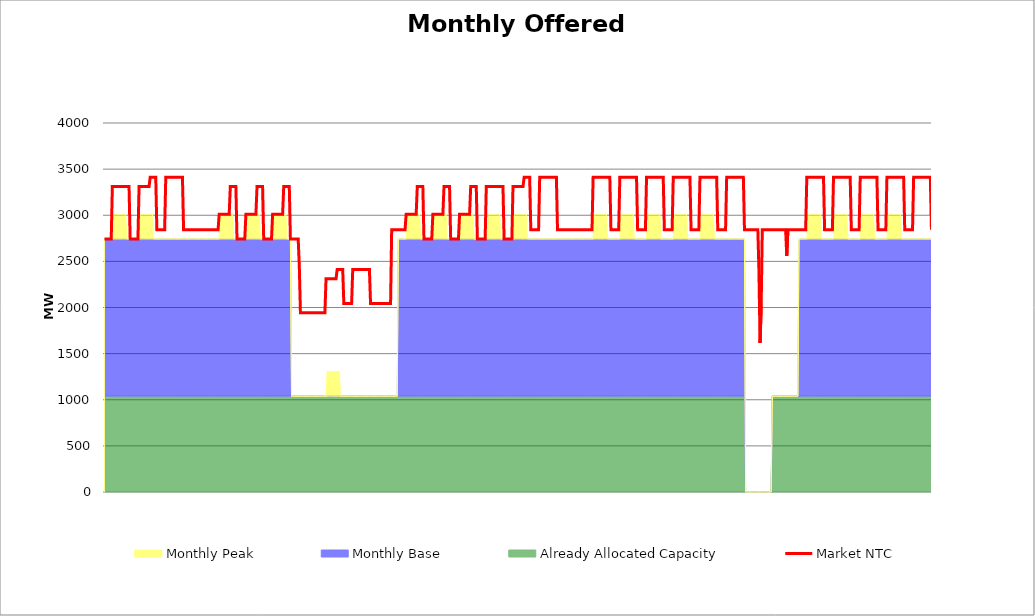
| Category | Market NTC |
|---|---|
| 0 | 2743 |
| 1 | 2743 |
| 2 | 2743 |
| 3 | 2743 |
| 4 | 2743 |
| 5 | 2743 |
| 6 | 2743 |
| 7 | 3311 |
| 8 | 3311 |
| 9 | 3311 |
| 10 | 3311 |
| 11 | 3311 |
| 12 | 3311 |
| 13 | 3311 |
| 14 | 3311 |
| 15 | 3311 |
| 16 | 3311 |
| 17 | 3311 |
| 18 | 3311 |
| 19 | 3311 |
| 20 | 3311 |
| 21 | 3311 |
| 22 | 3311 |
| 23 | 2743 |
| 24 | 2743 |
| 25 | 2743 |
| 26 | 2743 |
| 27 | 2743 |
| 28 | 2743 |
| 29 | 2743 |
| 30 | 2743 |
| 31 | 3311 |
| 32 | 3311 |
| 33 | 3311 |
| 34 | 3311 |
| 35 | 3311 |
| 36 | 3311 |
| 37 | 3311 |
| 38 | 3311 |
| 39 | 3311 |
| 40 | 3311 |
| 41 | 3411 |
| 42 | 3411 |
| 43 | 3411 |
| 44 | 3411 |
| 45 | 3411 |
| 46 | 3411 |
| 47 | 2843 |
| 48 | 2843 |
| 49 | 2843 |
| 50 | 2843 |
| 51 | 2843 |
| 52 | 2843 |
| 53 | 2843 |
| 54 | 2843 |
| 55 | 3411 |
| 56 | 3411 |
| 57 | 3411 |
| 58 | 3411 |
| 59 | 3411 |
| 60 | 3411 |
| 61 | 3411 |
| 62 | 3411 |
| 63 | 3411 |
| 64 | 3411 |
| 65 | 3411 |
| 66 | 3411 |
| 67 | 3411 |
| 68 | 3411 |
| 69 | 3411 |
| 70 | 3411 |
| 71 | 2843 |
| 72 | 2843 |
| 73 | 2843 |
| 74 | 2843 |
| 75 | 2843 |
| 76 | 2843 |
| 77 | 2843 |
| 78 | 2843 |
| 79 | 2843 |
| 80 | 2843 |
| 81 | 2843 |
| 82 | 2843 |
| 83 | 2843 |
| 84 | 2843 |
| 85 | 2843 |
| 86 | 2843 |
| 87 | 2843 |
| 88 | 2843 |
| 89 | 2843 |
| 90 | 2843 |
| 91 | 2843 |
| 92 | 2843 |
| 93 | 2843 |
| 94 | 2843 |
| 95 | 2843 |
| 96 | 2843 |
| 97 | 2843 |
| 98 | 2843 |
| 99 | 2843 |
| 100 | 2843 |
| 101 | 2843 |
| 102 | 2843 |
| 103 | 3011 |
| 104 | 3011 |
| 105 | 3011 |
| 106 | 3011 |
| 107 | 3011 |
| 108 | 3011 |
| 109 | 3011 |
| 110 | 3011 |
| 111 | 3011 |
| 112 | 3011 |
| 113 | 3311 |
| 114 | 3311 |
| 115 | 3311 |
| 116 | 3311 |
| 117 | 3311 |
| 118 | 3311 |
| 119 | 2743 |
| 120 | 2743 |
| 121 | 2743 |
| 122 | 2743 |
| 123 | 2743 |
| 124 | 2743 |
| 125 | 2743 |
| 126 | 2743 |
| 127 | 3011 |
| 128 | 3011 |
| 129 | 3011 |
| 130 | 3011 |
| 131 | 3011 |
| 132 | 3011 |
| 133 | 3011 |
| 134 | 3011 |
| 135 | 3011 |
| 136 | 3011 |
| 137 | 3311 |
| 138 | 3311 |
| 139 | 3311 |
| 140 | 3311 |
| 141 | 3311 |
| 142 | 3311 |
| 143 | 2743 |
| 144 | 2743 |
| 145 | 2743 |
| 146 | 2743 |
| 147 | 2743 |
| 148 | 2743 |
| 149 | 2743 |
| 150 | 2743 |
| 151 | 3011 |
| 152 | 3011 |
| 153 | 3011 |
| 154 | 3011 |
| 155 | 3011 |
| 156 | 3011 |
| 157 | 3011 |
| 158 | 3011 |
| 159 | 3011 |
| 160 | 3011 |
| 161 | 3311 |
| 162 | 3311 |
| 163 | 3311 |
| 164 | 3311 |
| 165 | 3311 |
| 166 | 3311 |
| 167 | 2743 |
| 168 | 2743 |
| 169 | 2743 |
| 170 | 2743 |
| 171 | 2743 |
| 172 | 2743 |
| 173 | 2743 |
| 174 | 2743 |
| 175 | 2443 |
| 176 | 1943 |
| 177 | 1943 |
| 178 | 1943 |
| 179 | 1943 |
| 180 | 1943 |
| 181 | 1943 |
| 182 | 1943 |
| 183 | 1943 |
| 184 | 1943 |
| 185 | 1943 |
| 186 | 1943 |
| 187 | 1943 |
| 188 | 1943 |
| 189 | 1943 |
| 190 | 1943 |
| 191 | 1943 |
| 192 | 1943 |
| 193 | 1943 |
| 194 | 1943 |
| 195 | 1943 |
| 196 | 1943 |
| 197 | 1943 |
| 198 | 1943 |
| 199 | 2311 |
| 200 | 2311 |
| 201 | 2311 |
| 202 | 2311 |
| 203 | 2311 |
| 204 | 2311 |
| 205 | 2311 |
| 206 | 2311 |
| 207 | 2311 |
| 208 | 2311 |
| 209 | 2411 |
| 210 | 2411 |
| 211 | 2411 |
| 212 | 2411 |
| 213 | 2411 |
| 214 | 2411 |
| 215 | 2043 |
| 216 | 2043 |
| 217 | 2043 |
| 218 | 2043 |
| 219 | 2043 |
| 220 | 2043 |
| 221 | 2043 |
| 222 | 2043 |
| 223 | 2411 |
| 224 | 2411 |
| 225 | 2411 |
| 226 | 2411 |
| 227 | 2411 |
| 228 | 2411 |
| 229 | 2411 |
| 230 | 2411 |
| 231 | 2411 |
| 232 | 2411 |
| 233 | 2411 |
| 234 | 2411 |
| 235 | 2411 |
| 236 | 2411 |
| 237 | 2411 |
| 238 | 2411 |
| 239 | 2043 |
| 240 | 2043 |
| 241 | 2043 |
| 242 | 2043 |
| 243 | 2043 |
| 244 | 2043 |
| 245 | 2043 |
| 246 | 2043 |
| 247 | 2043 |
| 248 | 2043 |
| 249 | 2043 |
| 250 | 2043 |
| 251 | 2043 |
| 252 | 2043 |
| 253 | 2043 |
| 254 | 2043 |
| 255 | 2043 |
| 256 | 2043 |
| 257 | 2043 |
| 258 | 2843 |
| 259 | 2843 |
| 260 | 2843 |
| 261 | 2843 |
| 262 | 2843 |
| 263 | 2843 |
| 264 | 2843 |
| 265 | 2843 |
| 266 | 2843 |
| 267 | 2843 |
| 268 | 2843 |
| 269 | 2843 |
| 270 | 2843 |
| 271 | 3011 |
| 272 | 3011 |
| 273 | 3011 |
| 274 | 3011 |
| 275 | 3011 |
| 276 | 3011 |
| 277 | 3011 |
| 278 | 3011 |
| 279 | 3011 |
| 280 | 3011 |
| 281 | 3311 |
| 282 | 3311 |
| 283 | 3311 |
| 284 | 3311 |
| 285 | 3311 |
| 286 | 3311 |
| 287 | 2743 |
| 288 | 2743 |
| 289 | 2743 |
| 290 | 2743 |
| 291 | 2743 |
| 292 | 2743 |
| 293 | 2743 |
| 294 | 2743 |
| 295 | 3011 |
| 296 | 3011 |
| 297 | 3011 |
| 298 | 3011 |
| 299 | 3011 |
| 300 | 3011 |
| 301 | 3011 |
| 302 | 3011 |
| 303 | 3011 |
| 304 | 3011 |
| 305 | 3311 |
| 306 | 3311 |
| 307 | 3311 |
| 308 | 3311 |
| 309 | 3311 |
| 310 | 3311 |
| 311 | 2743 |
| 312 | 2743 |
| 313 | 2743 |
| 314 | 2743 |
| 315 | 2743 |
| 316 | 2743 |
| 317 | 2743 |
| 318 | 2743 |
| 319 | 3011 |
| 320 | 3011 |
| 321 | 3011 |
| 322 | 3011 |
| 323 | 3011 |
| 324 | 3011 |
| 325 | 3011 |
| 326 | 3011 |
| 327 | 3011 |
| 328 | 3011 |
| 329 | 3311 |
| 330 | 3311 |
| 331 | 3311 |
| 332 | 3311 |
| 333 | 3311 |
| 334 | 3311 |
| 335 | 2743 |
| 336 | 2743 |
| 337 | 2743 |
| 338 | 2743 |
| 339 | 2743 |
| 340 | 2743 |
| 341 | 2743 |
| 342 | 2743 |
| 343 | 3311 |
| 344 | 3311 |
| 345 | 3311 |
| 346 | 3311 |
| 347 | 3311 |
| 348 | 3311 |
| 349 | 3311 |
| 350 | 3311 |
| 351 | 3311 |
| 352 | 3311 |
| 353 | 3311 |
| 354 | 3311 |
| 355 | 3311 |
| 356 | 3311 |
| 357 | 3311 |
| 358 | 3311 |
| 359 | 2743 |
| 360 | 2743 |
| 361 | 2743 |
| 362 | 2743 |
| 363 | 2743 |
| 364 | 2743 |
| 365 | 2743 |
| 366 | 2743 |
| 367 | 3311 |
| 368 | 3311 |
| 369 | 3311 |
| 370 | 3311 |
| 371 | 3311 |
| 372 | 3311 |
| 373 | 3311 |
| 374 | 3311 |
| 375 | 3311 |
| 376 | 3311 |
| 377 | 3411 |
| 378 | 3411 |
| 379 | 3411 |
| 380 | 3411 |
| 381 | 3411 |
| 382 | 3411 |
| 383 | 2843 |
| 384 | 2843 |
| 385 | 2843 |
| 386 | 2843 |
| 387 | 2843 |
| 388 | 2843 |
| 389 | 2843 |
| 390 | 2843 |
| 391 | 3411 |
| 392 | 3411 |
| 393 | 3411 |
| 394 | 3411 |
| 395 | 3411 |
| 396 | 3411 |
| 397 | 3411 |
| 398 | 3411 |
| 399 | 3411 |
| 400 | 3411 |
| 401 | 3411 |
| 402 | 3411 |
| 403 | 3411 |
| 404 | 3411 |
| 405 | 3411 |
| 406 | 3411 |
| 407 | 2843 |
| 408 | 2843 |
| 409 | 2843 |
| 410 | 2843 |
| 411 | 2843 |
| 412 | 2843 |
| 413 | 2843 |
| 414 | 2843 |
| 415 | 2843 |
| 416 | 2843 |
| 417 | 2843 |
| 418 | 2843 |
| 419 | 2843 |
| 420 | 2843 |
| 421 | 2843 |
| 422 | 2843 |
| 423 | 2843 |
| 424 | 2843 |
| 425 | 2843 |
| 426 | 2843 |
| 427 | 2843 |
| 428 | 2843 |
| 429 | 2843 |
| 430 | 2843 |
| 431 | 2843 |
| 432 | 2843 |
| 433 | 2843 |
| 434 | 2843 |
| 435 | 2843 |
| 436 | 2843 |
| 437 | 2843 |
| 438 | 2843 |
| 439 | 3411 |
| 440 | 3411 |
| 441 | 3411 |
| 442 | 3411 |
| 443 | 3411 |
| 444 | 3411 |
| 445 | 3411 |
| 446 | 3411 |
| 447 | 3411 |
| 448 | 3411 |
| 449 | 3411 |
| 450 | 3411 |
| 451 | 3411 |
| 452 | 3411 |
| 453 | 3411 |
| 454 | 3411 |
| 455 | 2843 |
| 456 | 2843 |
| 457 | 2843 |
| 458 | 2843 |
| 459 | 2843 |
| 460 | 2843 |
| 461 | 2843 |
| 462 | 2843 |
| 463 | 3411 |
| 464 | 3411 |
| 465 | 3411 |
| 466 | 3411 |
| 467 | 3411 |
| 468 | 3411 |
| 469 | 3411 |
| 470 | 3411 |
| 471 | 3411 |
| 472 | 3411 |
| 473 | 3411 |
| 474 | 3411 |
| 475 | 3411 |
| 476 | 3411 |
| 477 | 3411 |
| 478 | 3411 |
| 479 | 2843 |
| 480 | 2843 |
| 481 | 2843 |
| 482 | 2843 |
| 483 | 2843 |
| 484 | 2843 |
| 485 | 2843 |
| 486 | 2843 |
| 487 | 3411 |
| 488 | 3411 |
| 489 | 3411 |
| 490 | 3411 |
| 491 | 3411 |
| 492 | 3411 |
| 493 | 3411 |
| 494 | 3411 |
| 495 | 3411 |
| 496 | 3411 |
| 497 | 3411 |
| 498 | 3411 |
| 499 | 3411 |
| 500 | 3411 |
| 501 | 3411 |
| 502 | 3411 |
| 503 | 2843 |
| 504 | 2843 |
| 505 | 2843 |
| 506 | 2843 |
| 507 | 2843 |
| 508 | 2843 |
| 509 | 2843 |
| 510 | 2843 |
| 511 | 3411 |
| 512 | 3411 |
| 513 | 3411 |
| 514 | 3411 |
| 515 | 3411 |
| 516 | 3411 |
| 517 | 3411 |
| 518 | 3411 |
| 519 | 3411 |
| 520 | 3411 |
| 521 | 3411 |
| 522 | 3411 |
| 523 | 3411 |
| 524 | 3411 |
| 525 | 3411 |
| 526 | 3411 |
| 527 | 2843 |
| 528 | 2843 |
| 529 | 2843 |
| 530 | 2843 |
| 531 | 2843 |
| 532 | 2843 |
| 533 | 2843 |
| 534 | 2843 |
| 535 | 3411 |
| 536 | 3411 |
| 537 | 3411 |
| 538 | 3411 |
| 539 | 3411 |
| 540 | 3411 |
| 541 | 3411 |
| 542 | 3411 |
| 543 | 3411 |
| 544 | 3411 |
| 545 | 3411 |
| 546 | 3411 |
| 547 | 3411 |
| 548 | 3411 |
| 549 | 3411 |
| 550 | 3411 |
| 551 | 2843 |
| 552 | 2843 |
| 553 | 2843 |
| 554 | 2843 |
| 555 | 2843 |
| 556 | 2843 |
| 557 | 2843 |
| 558 | 2843 |
| 559 | 3411 |
| 560 | 3411 |
| 561 | 3411 |
| 562 | 3411 |
| 563 | 3411 |
| 564 | 3411 |
| 565 | 3411 |
| 566 | 3411 |
| 567 | 3411 |
| 568 | 3411 |
| 569 | 3411 |
| 570 | 3411 |
| 571 | 3411 |
| 572 | 3411 |
| 573 | 3411 |
| 574 | 3411 |
| 575 | 2843 |
| 576 | 2843 |
| 577 | 2843 |
| 578 | 2843 |
| 579 | 2843 |
| 580 | 2843 |
| 581 | 2843 |
| 582 | 2843 |
| 583 | 2843 |
| 584 | 2843 |
| 585 | 2843 |
| 586 | 2843 |
| 587 | 2843 |
| 588 | 2401 |
| 589 | 1615 |
| 590 | 2012 |
| 591 | 2843 |
| 592 | 2843 |
| 593 | 2843 |
| 594 | 2843 |
| 595 | 2843 |
| 596 | 2843 |
| 597 | 2843 |
| 598 | 2843 |
| 599 | 2843 |
| 600 | 2843 |
| 601 | 2843 |
| 602 | 2843 |
| 603 | 2843 |
| 604 | 2843 |
| 605 | 2843 |
| 606 | 2843 |
| 607 | 2843 |
| 608 | 2843 |
| 609 | 2843 |
| 610 | 2843 |
| 611 | 2843 |
| 612 | 2843 |
| 613 | 2559 |
| 614 | 2843 |
| 615 | 2843 |
| 616 | 2843 |
| 617 | 2843 |
| 618 | 2843 |
| 619 | 2843 |
| 620 | 2843 |
| 621 | 2843 |
| 622 | 2843 |
| 623 | 2843 |
| 624 | 2843 |
| 625 | 2843 |
| 626 | 2843 |
| 627 | 2843 |
| 628 | 2843 |
| 629 | 2843 |
| 630 | 2843 |
| 631 | 3411 |
| 632 | 3411 |
| 633 | 3411 |
| 634 | 3411 |
| 635 | 3411 |
| 636 | 3411 |
| 637 | 3411 |
| 638 | 3411 |
| 639 | 3411 |
| 640 | 3411 |
| 641 | 3411 |
| 642 | 3411 |
| 643 | 3411 |
| 644 | 3411 |
| 645 | 3411 |
| 646 | 3411 |
| 647 | 2843 |
| 648 | 2843 |
| 649 | 2843 |
| 650 | 2843 |
| 651 | 2843 |
| 652 | 2843 |
| 653 | 2843 |
| 654 | 2843 |
| 655 | 3411 |
| 656 | 3411 |
| 657 | 3411 |
| 658 | 3411 |
| 659 | 3411 |
| 660 | 3411 |
| 661 | 3411 |
| 662 | 3411 |
| 663 | 3411 |
| 664 | 3411 |
| 665 | 3411 |
| 666 | 3411 |
| 667 | 3411 |
| 668 | 3411 |
| 669 | 3411 |
| 670 | 3411 |
| 671 | 2843 |
| 672 | 2843 |
| 673 | 2843 |
| 674 | 2843 |
| 675 | 2843 |
| 676 | 2843 |
| 677 | 2843 |
| 678 | 2843 |
| 679 | 3411 |
| 680 | 3411 |
| 681 | 3411 |
| 682 | 3411 |
| 683 | 3411 |
| 684 | 3411 |
| 685 | 3411 |
| 686 | 3411 |
| 687 | 3411 |
| 688 | 3411 |
| 689 | 3411 |
| 690 | 3411 |
| 691 | 3411 |
| 692 | 3411 |
| 693 | 3411 |
| 694 | 3411 |
| 695 | 2843 |
| 696 | 2843 |
| 697 | 2843 |
| 698 | 2843 |
| 699 | 2843 |
| 700 | 2843 |
| 701 | 2843 |
| 702 | 2843 |
| 703 | 3411 |
| 704 | 3411 |
| 705 | 3411 |
| 706 | 3411 |
| 707 | 3411 |
| 708 | 3411 |
| 709 | 3411 |
| 710 | 3411 |
| 711 | 3411 |
| 712 | 3411 |
| 713 | 3411 |
| 714 | 3411 |
| 715 | 3411 |
| 716 | 3411 |
| 717 | 3411 |
| 718 | 3411 |
| 719 | 2843 |
| 720 | 2843 |
| 721 | 2843 |
| 722 | 2843 |
| 723 | 2843 |
| 724 | 2843 |
| 725 | 2843 |
| 726 | 2843 |
| 727 | 3411 |
| 728 | 3411 |
| 729 | 3411 |
| 730 | 3411 |
| 731 | 3411 |
| 732 | 3411 |
| 733 | 3411 |
| 734 | 3411 |
| 735 | 3411 |
| 736 | 3411 |
| 737 | 3411 |
| 738 | 3411 |
| 739 | 3411 |
| 740 | 3411 |
| 741 | 3411 |
| 742 | 3411 |
| 743 | 2843 |